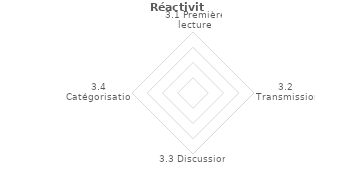
| Category | Series 2 |
|---|---|
| 3.1 Première lecture | 0 |
| 3.2 Transmission | 0 |
| 3.3 Discussion | 0 |
| 3.4 Catégorisation | 0 |